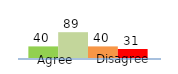
| Category | Series 0 | Series 1 | Series 2 | Series 3 |
|---|---|---|---|---|
| 0 | 40 | 89 | 40 | 31 |